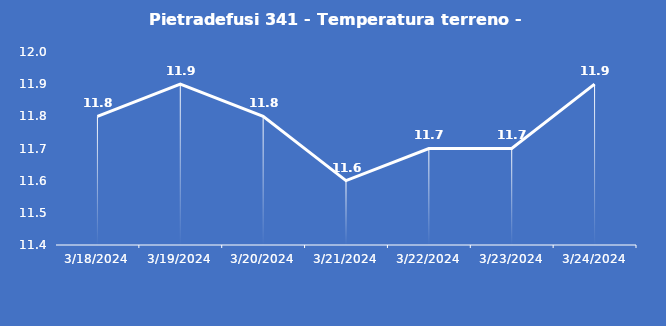
| Category | Pietradefusi 341 - Temperatura terreno - Grezzo (°C) |
|---|---|
| 3/18/24 | 11.8 |
| 3/19/24 | 11.9 |
| 3/20/24 | 11.8 |
| 3/21/24 | 11.6 |
| 3/22/24 | 11.7 |
| 3/23/24 | 11.7 |
| 3/24/24 | 11.9 |